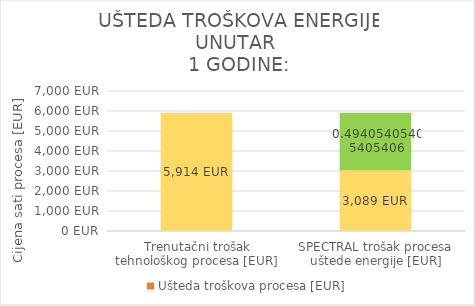
| Category | Trenutačni trošak tehnološkog procesa [EUR] | Ušteda troškova procesa [EUR] |
|---|---|---|
| Trenutačni trošak tehnološkog procesa [EUR] | 5914 | 0 |
| SPECTRAL trošak procesa uštede energije [EUR] | 3089 | 2825 |